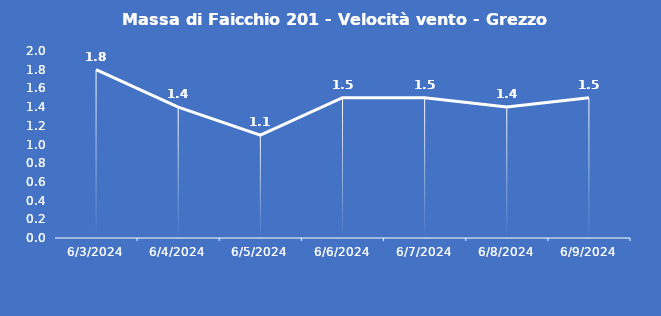
| Category | Massa di Faicchio 201 - Velocità vento - Grezzo (m/s) |
|---|---|
| 6/3/24 | 1.8 |
| 6/4/24 | 1.4 |
| 6/5/24 | 1.1 |
| 6/6/24 | 1.5 |
| 6/7/24 | 1.5 |
| 6/8/24 | 1.4 |
| 6/9/24 | 1.5 |